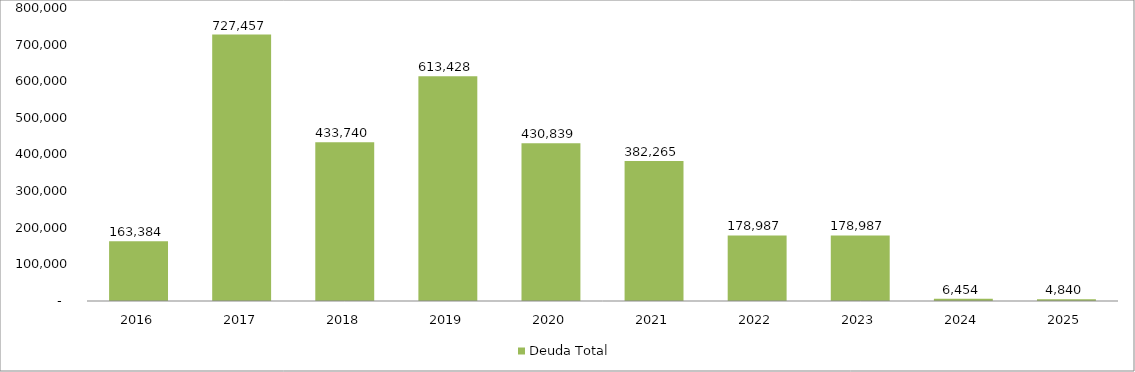
| Category | Deuda Total |
|---|---|
| 2016 | 163383.719 |
| 2017 | 727457.237 |
| 2018 | 433739.801 |
| 2019 | 613427.739 |
| 2020 | 430838.97 |
| 2021 | 382264.779 |
| 2022 | 178987.17 |
| 2023 | 178987.17 |
| 2024 | 6453.836 |
| 2025 | 4840.377 |